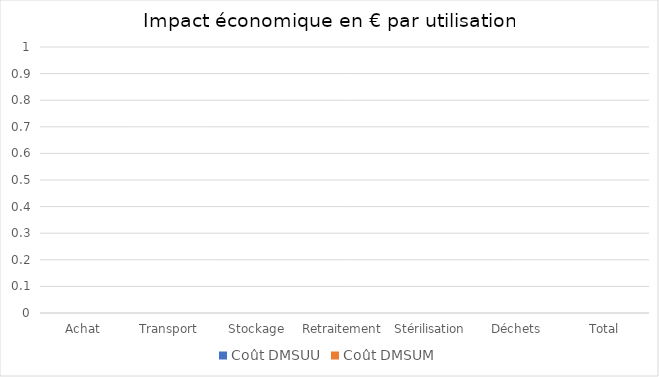
| Category | Coût |
|---|---|
| Achat | 0 |
| Transport | 0 |
| Stockage | 0 |
| Retraitement | 0 |
| Stérilisation | 0 |
| Déchets | 0 |
| Total | 0 |